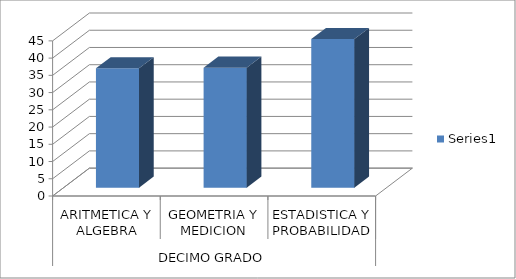
| Category | Series 0 |
|---|---|
| 0 | 34.62 |
| 1 | 34.81 |
| 2 | 43.09 |